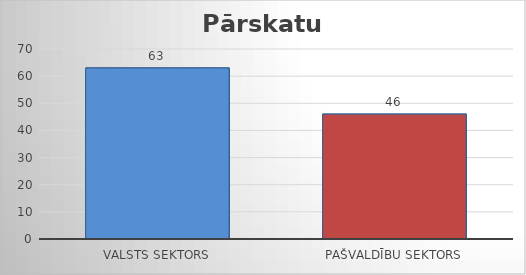
| Category | Series 0 |
|---|---|
| Valsts sektors | 63 |
| Pašvaldību sektors | 46 |